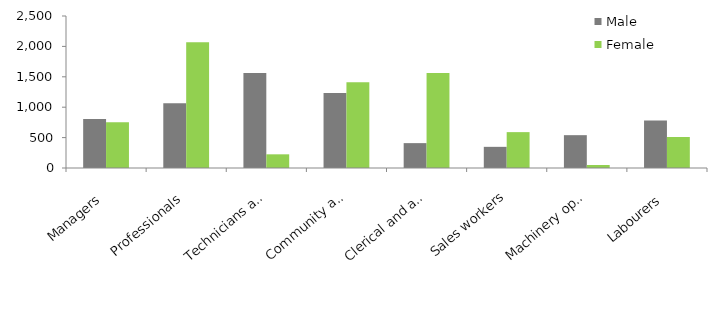
| Category | Male | Female |
|---|---|---|
| Managers | 807 | 752 |
| Professionals | 1064 | 2067 |
| Technicians and trades workers | 1561 | 225 |
| Community and personal service workers | 1232 | 1411 |
| Clerical and administrative workers | 409 | 1561 |
| Sales workers | 348 | 590 |
| Machinery operators and drivers | 540 | 49 |
| Labourers | 781 | 510 |